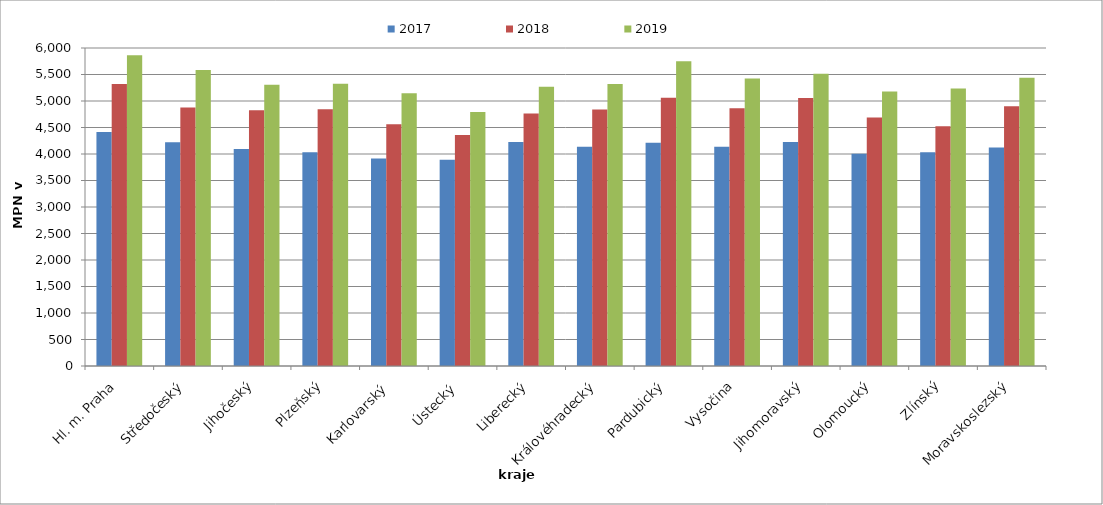
| Category | 2017 | 2018 | 2019 |
|---|---|---|---|
| Hl. m. Praha | 4413.454 | 5319.114 | 5863.823 |
| Středočeský | 4223.772 | 4879.601 | 5584.918 |
| Jihočeský | 4093.304 | 4826.015 | 5308.452 |
| Plzeňský | 4035.328 | 4842.336 | 5325.547 |
| Karlovarský  | 3915.689 | 4562.91 | 5145.409 |
| Ústecký   | 3893.8 | 4356.624 | 4792.344 |
| Liberecký | 4224.529 | 4762.685 | 5267.954 |
| Královéhradecký | 4135.266 | 4838.325 | 5322.061 |
| Pardubický | 4210.68 | 5060.518 | 5749.191 |
| Vysočina | 4135.477 | 4863.525 | 5422.949 |
| Jihomoravský | 4226.712 | 5058.058 | 5514.814 |
| Olomoucký | 4006.654 | 4687.631 | 5179.93 |
| Zlínský | 4032.284 | 4525.885 | 5234.43 |
| Moravskoslezský | 4124.105 | 4900.557 | 5438.345 |